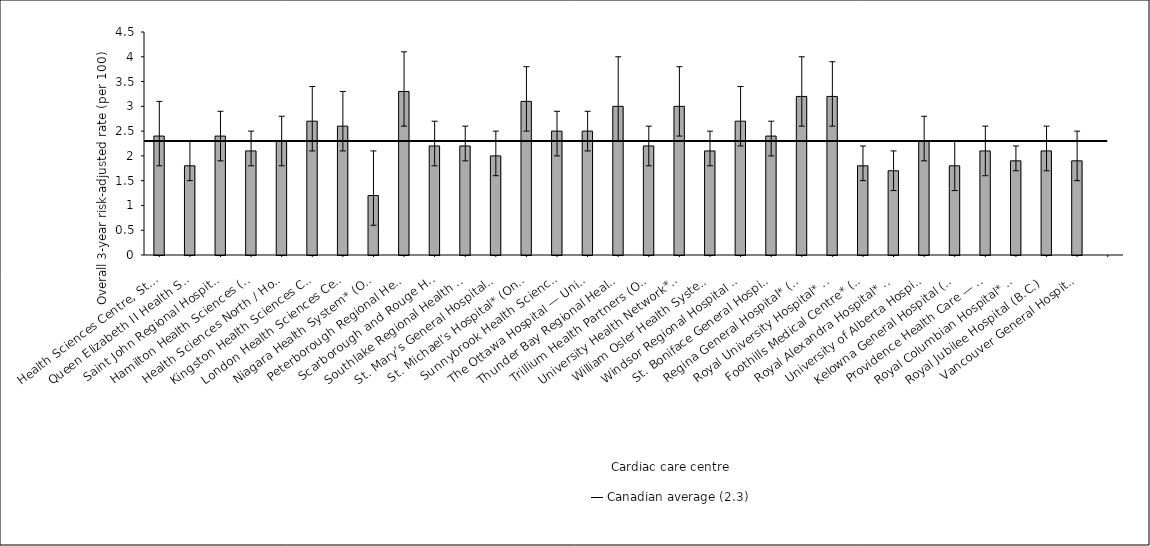
| Category | Risk-adjusted rate |
|---|---|
| Health Sciences Centre, St. John’s (N.L.) | 2.4 |
| Queen Elizabeth II Health Sciences Centre (N.S.) | 1.8 |
| Saint John Regional Hospital (N.B.) | 2.4 |
| Hamilton Health Sciences (Ont.) | 2.1 |
| Health Sciences North / Horizon Santé-Nord (Ont.) | 2.3 |
| Kingston Health Sciences Centre (Ont.) | 2.7 |
| London Health Sciences Centre (Ont.) | 2.6 |
| Niagara Health System* (Ont.) | 1.2 |
| Peterborough Regional Health Centre* (Ont.) | 3.3 |
| Scarborough and Rouge Hospital (Ont.) | 2.2 |
| Southlake Regional Health Centre (Ont.) | 2.2 |
| St. Mary’s General Hospital (Ont.) | 2 |
| St. Michael’s Hospital* (Ont.) | 3.1 |
| Sunnybrook Health Sciences Centre (Ont.) | 2.5 |
| The Ottawa Hospital — University of Ottawa Heart Institute (Ont.) | 2.5 |
| Thunder Bay Regional Health Sciences Centre (Ont.) | 3 |
| Trillium Health Partners (Ont.) | 2.2 |
| University Health Network* (Ont.) | 3 |
| William Osler Health System (Ont.) | 2.1 |
| Windsor Regional Hospital (Ont.) | 2.7 |
| St. Boniface General Hospital (Man.) | 2.4 |
| Regina General Hospital* (Sask.) | 3.2 |
| Royal University Hospital* (Sask.) | 3.2 |
| Foothills Medical Centre* (Alta.) | 1.8 |
| Royal Alexandra Hospital* (Alta.) | 1.7 |
| University of Alberta Hospital (Alta.) | 2.3 |
| Kelowna General Hospital (B.C.) | 1.8 |
| Providence Health Care — St. Paul’s Hospital (Vancouver) (B.C.) | 2.1 |
| Royal Columbian Hospital* (B.C.) | 1.9 |
| Royal Jubilee Hospital (B.C.) | 2.1 |
| Vancouver General Hospital (B.C.) | 1.9 |